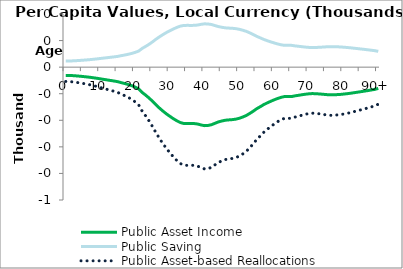
| Category | Public Asset Income | Public Saving | Public Asset-based Reallocations |
|---|---|---|---|
| 0 | -30.998 | 22.949 | -53.946 |
|  | -31.215 | 23.11 | -54.325 |
| 2 | -31.915 | 23.628 | -55.542 |
| 3 | -32.878 | 24.341 | -57.218 |
| 4 | -34.011 | 25.18 | -59.191 |
| 5 | -35.323 | 26.151 | -61.473 |
| 6 | -36.682 | 27.157 | -63.838 |
| 7 | -38.229 | 28.302 | -66.531 |
| 8 | -40.01 | 29.621 | -69.631 |
| 9 | -41.957 | 31.062 | -73.019 |
| 10 | -44.059 | 32.618 | -76.677 |
| 11 | -46.193 | 34.198 | -80.391 |
| 12 | -48.266 | 35.733 | -83.999 |
| 13 | -50.325 | 37.257 | -87.582 |
| 14 | -52.396 | 38.791 | -91.186 |
| 15 | -54.748 | 40.532 | -95.28 |
| 16 | -58.417 | 43.248 | -101.665 |
| 17 | -61.694 | 45.674 | -107.368 |
| 18 | -65.427 | 48.438 | -113.865 |
| 19 | -69.767 | 51.651 | -121.419 |
| 20 | -75.096 | 55.596 | -130.692 |
| 21 | -81.59 | 60.404 | -141.995 |
| 22 | -95.098 | 70.405 | -165.503 |
| 23 | -105.255 | 77.924 | -183.179 |
| 24 | -116.168 | 86.004 | -202.172 |
| 25 | -128.703 | 95.284 | -223.987 |
| 26 | -142.052 | 105.166 | -247.218 |
| 27 | -154.197 | 114.158 | -268.355 |
| 28 | -165.546 | 122.56 | -288.106 |
| 29 | -175.937 | 130.253 | -306.191 |
| 30 | -185.138 | 137.064 | -322.202 |
| 31 | -194.072 | 143.679 | -337.751 |
| 32 | -201.948 | 149.51 | -351.457 |
| 33 | -208.465 | 154.334 | -362.799 |
| 34 | -212.059 | 156.995 | -369.054 |
| 35 | -212.398 | 157.246 | -369.643 |
| 36 | -212.203 | 157.102 | -369.305 |
| 37 | -212.383 | 157.235 | -369.618 |
| 38 | -214.07 | 158.484 | -372.555 |
| 39 | -217.691 | 161.165 | -378.856 |
| 40 | -220.156 | 162.99 | -383.146 |
| 41 | -219.39 | 162.423 | -381.814 |
| 42 | -216.543 | 160.315 | -376.858 |
| 43 | -211.148 | 156.321 | -367.469 |
| 44 | -206.009 | 152.516 | -358.525 |
| 45 | -202.464 | 149.892 | -352.356 |
| 46 | -199.724 | 147.864 | -347.588 |
| 47 | -198.461 | 146.928 | -345.389 |
| 48 | -197.478 | 146.2 | -343.678 |
| 49 | -195.607 | 144.815 | -340.422 |
| 50 | -192.371 | 142.42 | -334.791 |
| 51 | -187.583 | 138.875 | -326.457 |
| 52 | -181.999 | 134.74 | -316.739 |
| 53 | -174.209 | 128.973 | -303.182 |
| 54 | -165.787 | 122.738 | -288.525 |
| 55 | -156.435 | 115.815 | -272.249 |
| 56 | -149.031 | 110.333 | -259.365 |
| 57 | -141.143 | 104.494 | -245.637 |
| 58 | -134.721 | 99.739 | -234.459 |
| 59 | -128.753 | 95.321 | -224.074 |
| 60 | -123.15 | 91.173 | -214.323 |
| 61 | -117.973 | 87.34 | -205.313 |
| 62 | -113.636 | 84.129 | -197.764 |
| 63 | -110.671 | 81.934 | -192.605 |
| 64 | -110.642 | 81.913 | -192.555 |
| 65 | -110.845 | 82.062 | -192.907 |
| 66 | -108.057 | 79.998 | -188.055 |
| 67 | -106.102 | 78.552 | -184.654 |
| 68 | -103.93 | 76.943 | -180.874 |
| 69 | -101.941 | 75.47 | -177.411 |
| 70 | -100.394 | 74.325 | -174.719 |
| 71 | -99.5 | 73.664 | -173.163 |
| 72 | -100.012 | 74.043 | -174.055 |
| 73 | -100.876 | 74.683 | -175.559 |
| 74 | -101.976 | 75.497 | -177.473 |
| 75 | -103.232 | 76.426 | -179.658 |
| 76 | -104.212 | 77.152 | -181.364 |
| 77 | -104.178 | 77.127 | -181.304 |
| 78 | -103.49 | 76.618 | -180.108 |
| 79 | -102.765 | 76.081 | -178.847 |
| 80 | -101.416 | 75.082 | -176.498 |
| 81 | -99.947 | 73.994 | -173.941 |
| 82 | -98.268 | 72.751 | -171.019 |
| 83 | -96.221 | 71.236 | -167.456 |
| 84 | -94.327 | 69.834 | -164.16 |
| 85 | -92.288 | 68.324 | -160.612 |
| 86 | -90.305 | 66.856 | -157.161 |
| 87 | -88.198 | 65.296 | -153.494 |
| 88 | -85.937 | 63.622 | -149.559 |
| 89 | -83.662 | 61.938 | -145.6 |
| 90+ | -80.147 | 59.336 | -139.483 |